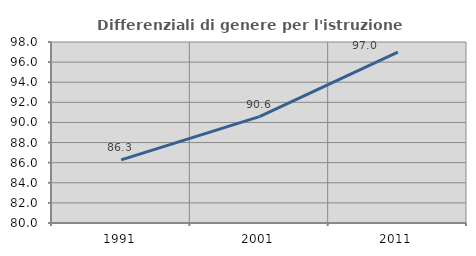
| Category | Differenziali di genere per l'istruzione superiore |
|---|---|
| 1991.0 | 86.273 |
| 2001.0 | 90.581 |
| 2011.0 | 97.001 |